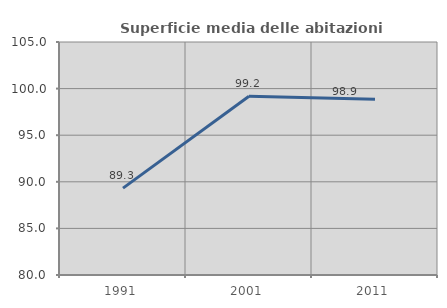
| Category | Superficie media delle abitazioni occupate |
|---|---|
| 1991.0 | 89.324 |
| 2001.0 | 99.181 |
| 2011.0 | 98.851 |